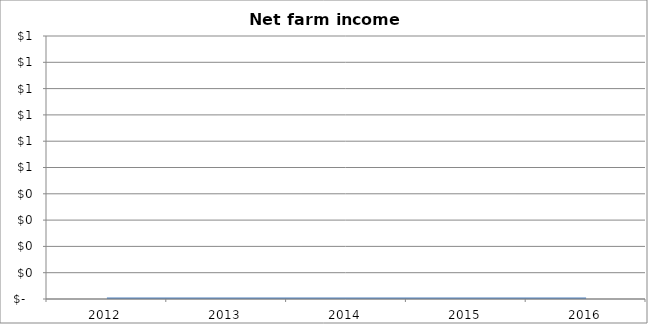
| Category | Net farm income [I+J] |
|---|---|
| 2012.0 | 0 |
| 2013.0 | 0 |
| 2014.0 | 0 |
| 2015.0 | 0 |
| 2016.0 | 0 |